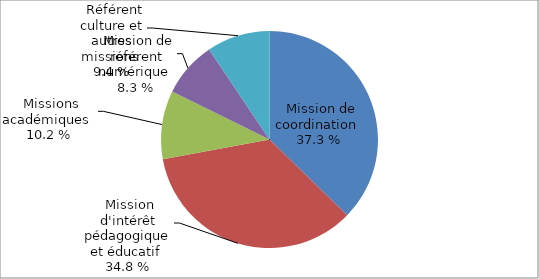
| Category | Attributions des IMP par type d'IMP |
|---|---|
| Mission de coordination | 0.373 |
| Mission d'intérêt pédagogique et éducatif | 0.348 |
| Missions académiques | 0.102 |
| Mission de référent numérique | 0.083 |
| Référent culture et autres missions | 0.094 |